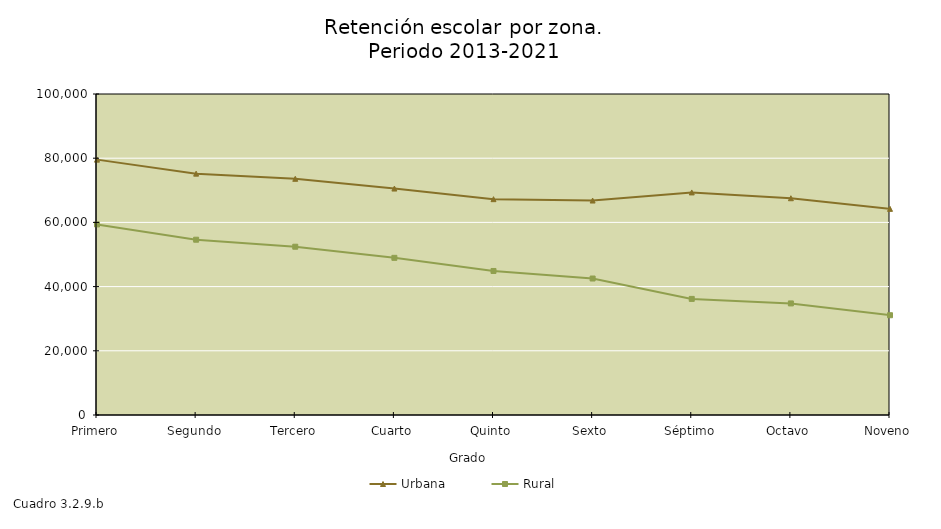
| Category | Urbana | Rural |
|---|---|---|
| Primero | 79554 | 59370 |
| Segundo | 75191 | 54605 |
| Tercero | 73580 | 52424 |
| Cuarto | 70545 | 48961 |
| Quinto | 67239 | 44867 |
| Sexto | 66812 | 42518 |
| Séptimo | 69335 | 36171 |
| Octavo | 67527 | 34758 |
| Noveno | 64214 | 31084 |